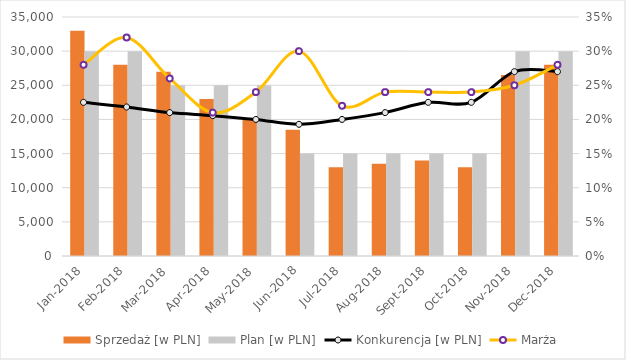
| Category | Sprzedaż [w PLN] | Plan [w PLN] |
|---|---|---|
| 2018-01-01 | 33000 | 30000 |
| 2018-02-01 | 28000 | 30000 |
| 2018-03-01 | 27000 | 25000 |
| 2018-04-01 | 23000 | 25000 |
| 2018-05-01 | 20000 | 25000 |
| 2018-06-01 | 18500 | 15000 |
| 2018-07-01 | 13000 | 15000 |
| 2018-08-01 | 13500 | 15000 |
| 2018-09-01 | 14000 | 15000 |
| 2018-10-01 | 13000 | 15000 |
| 2018-11-01 | 26500 | 30000 |
| 2018-12-01 | 28000 | 30000 |